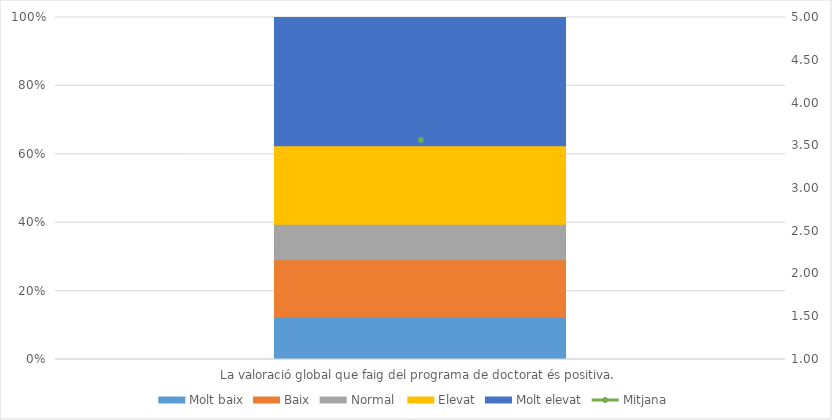
| Category | Molt baix | Baix | Normal  | Elevat | Molt elevat |
|---|---|---|---|---|---|
| La valoració global que faig del programa de doctorat és positiva. | 6 | 8 | 5 | 11 | 18 |